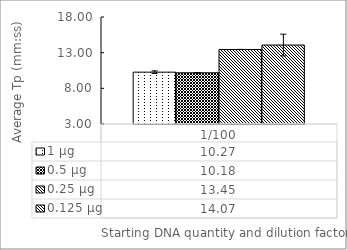
| Category | 1 µg | 0.5 µg | 0.25 µg | 0.125 µg |
|---|---|---|---|---|
| 1/100 | 10.27 | 10.18 | 13.45 | 14.07 |